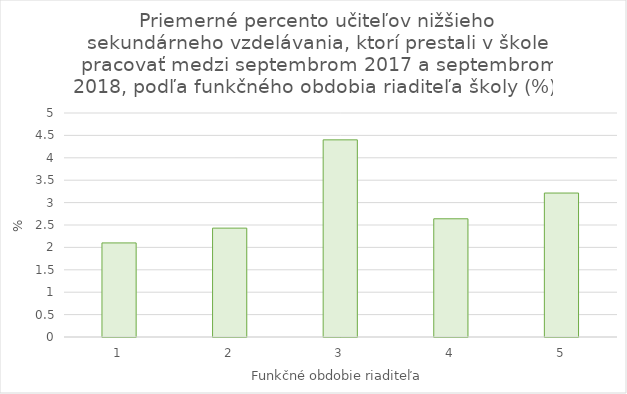
| Category | Series 0 |
|---|---|
| 0 | 2.1 |
| 1 | 2.43 |
| 2 | 4.401 |
| 3 | 2.638 |
| 4 | 3.213 |